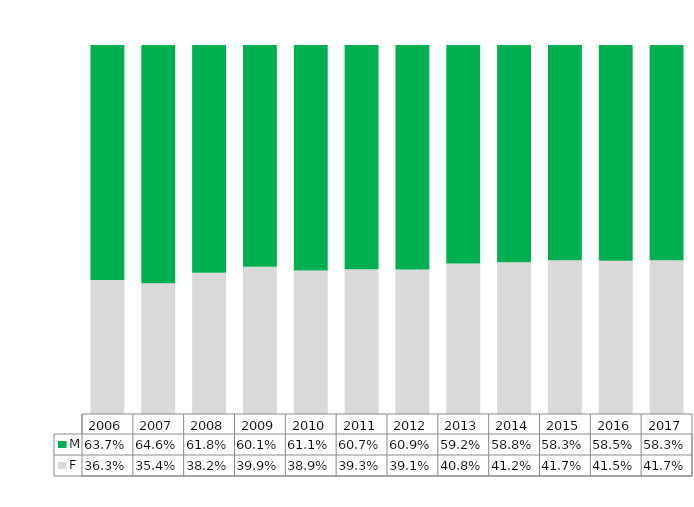
| Category | F | M |
|---|---|---|
| 2006.0 | 0.363 | 0.637 |
| 2007.0 | 0.354 | 0.646 |
| 2008.0 | 0.382 | 0.618 |
| 2009.0 | 0.399 | 0.601 |
| 2010.0 | 0.389 | 0.611 |
| 2011.0 | 0.393 | 0.607 |
| 2012.0 | 0.391 | 0.609 |
| 2013.0 | 0.408 | 0.592 |
| 2014.0 | 0.412 | 0.588 |
| 2015.0 | 0.417 | 0.583 |
| 2016.0 | 0.415 | 0.585 |
| 2017.0 | 0.417 | 0.583 |